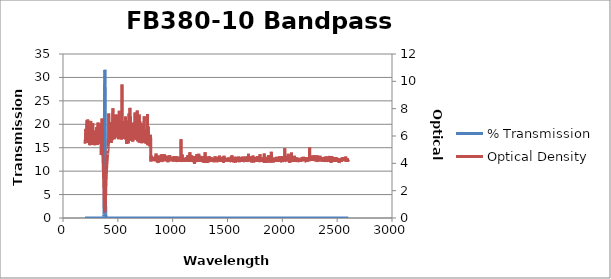
| Category | % Transmission |
|---|---|
| 2600.0 | 0.007 |
| 2599.0 | 0.007 |
| 2598.0 | 0.006 |
| 2597.0 | 0.008 |
| 2596.0 | 0.006 |
| 2595.0 | 0.006 |
| 2594.0 | 0.006 |
| 2593.0 | 0.004 |
| 2592.0 | 0.005 |
| 2591.0 | 0.007 |
| 2590.0 | 0.004 |
| 2589.0 | 0.005 |
| 2588.0 | 0.007 |
| 2587.0 | 0.004 |
| 2586.0 | 0.007 |
| 2585.0 | 0.005 |
| 2584.0 | 0.006 |
| 2583.0 | 0.005 |
| 2582.0 | 0.004 |
| 2581.0 | 0.005 |
| 2580.0 | 0.007 |
| 2579.0 | 0.005 |
| 2578.0 | 0.003 |
| 2577.0 | 0.006 |
| 2576.0 | 0.007 |
| 2575.0 | 0.006 |
| 2574.0 | 0.006 |
| 2573.0 | 0.005 |
| 2572.0 | 0.004 |
| 2571.0 | 0.006 |
| 2570.0 | 0.005 |
| 2569.0 | 0.007 |
| 2568.0 | 0.006 |
| 2567.0 | 0.006 |
| 2566.0 | 0.006 |
| 2565.0 | 0.004 |
| 2564.0 | 0.006 |
| 2563.0 | 0.006 |
| 2562.0 | 0.004 |
| 2561.0 | 0.005 |
| 2560.0 | 0.006 |
| 2559.0 | 0.005 |
| 2558.0 | 0.006 |
| 2557.0 | 0.004 |
| 2556.0 | 0.006 |
| 2555.0 | 0.005 |
| 2554.0 | 0.005 |
| 2553.0 | 0.006 |
| 2552.0 | 0.004 |
| 2551.0 | 0.005 |
| 2550.0 | 0.005 |
| 2549.0 | 0.006 |
| 2548.0 | 0.005 |
| 2547.0 | 0.006 |
| 2546.0 | 0.005 |
| 2545.0 | 0.004 |
| 2544.0 | 0.007 |
| 2543.0 | 0.004 |
| 2542.0 | 0.005 |
| 2541.0 | 0.005 |
| 2540.0 | 0.008 |
| 2539.0 | 0.006 |
| 2538.0 | 0.007 |
| 2537.0 | 0.005 |
| 2536.0 | 0.006 |
| 2535.0 | 0.007 |
| 2534.0 | 0.005 |
| 2533.0 | 0.006 |
| 2532.0 | 0.005 |
| 2531.0 | 0.006 |
| 2530.0 | 0.006 |
| 2529.0 | 0.005 |
| 2528.0 | 0.005 |
| 2527.0 | 0.005 |
| 2526.0 | 0.005 |
| 2525.0 | 0.006 |
| 2524.0 | 0.006 |
| 2523.0 | 0.005 |
| 2522.0 | 0.005 |
| 2521.0 | 0.006 |
| 2520.0 | 0.007 |
| 2519.0 | 0.007 |
| 2518.0 | 0.01 |
| 2517.0 | 0.005 |
| 2516.0 | 0.007 |
| 2515.0 | 0.007 |
| 2514.0 | 0.006 |
| 2513.0 | 0.006 |
| 2512.0 | 0.006 |
| 2511.0 | 0.005 |
| 2510.0 | 0.004 |
| 2509.0 | 0.006 |
| 2508.0 | 0.005 |
| 2507.0 | 0.006 |
| 2506.0 | 0.006 |
| 2505.0 | 0.005 |
| 2504.0 | 0.005 |
| 2503.0 | 0.006 |
| 2502.0 | 0.006 |
| 2501.0 | 0.004 |
| 2500.0 | 0.005 |
| 2499.0 | 0.006 |
| 2498.0 | 0.005 |
| 2497.0 | 0.005 |
| 2496.0 | 0.004 |
| 2495.0 | 0.007 |
| 2494.0 | 0.008 |
| 2493.0 | 0.005 |
| 2492.0 | 0.005 |
| 2491.0 | 0.004 |
| 2490.0 | 0.006 |
| 2489.0 | 0.008 |
| 2488.0 | 0.005 |
| 2487.0 | 0.004 |
| 2486.0 | 0.004 |
| 2485.0 | 0.005 |
| 2484.0 | 0.004 |
| 2483.0 | 0.004 |
| 2482.0 | 0.006 |
| 2481.0 | 0.006 |
| 2480.0 | 0.007 |
| 2479.0 | 0.004 |
| 2478.0 | 0.005 |
| 2477.0 | 0.006 |
| 2476.0 | 0.005 |
| 2475.0 | 0.005 |
| 2474.0 | 0.007 |
| 2473.0 | 0.005 |
| 2472.0 | 0.004 |
| 2471.0 | 0.006 |
| 2470.0 | 0.007 |
| 2469.0 | 0.005 |
| 2468.0 | 0.007 |
| 2467.0 | 0.007 |
| 2466.0 | 0.007 |
| 2465.0 | 0.006 |
| 2464.0 | 0.004 |
| 2463.0 | 0.007 |
| 2462.0 | 0.007 |
| 2461.0 | 0.004 |
| 2460.0 | 0.007 |
| 2459.0 | 0.007 |
| 2458.0 | 0.006 |
| 2457.0 | 0.007 |
| 2456.0 | 0.004 |
| 2455.0 | 0.006 |
| 2454.0 | 0.004 |
| 2453.0 | 0.003 |
| 2452.0 | 0.005 |
| 2451.0 | 0.007 |
| 2450.0 | 0.003 |
| 2449.0 | 0.006 |
| 2448.0 | 0.006 |
| 2447.0 | 0.007 |
| 2446.0 | 0.004 |
| 2445.0 | 0.009 |
| 2444.0 | 0.006 |
| 2443.0 | 0.008 |
| 2442.0 | 0.004 |
| 2441.0 | 0.006 |
| 2440.0 | 0.003 |
| 2439.0 | 0.004 |
| 2438.0 | 0.005 |
| 2437.0 | 0.004 |
| 2436.0 | 0.005 |
| 2435.0 | 0.005 |
| 2434.0 | 0.007 |
| 2433.0 | 0.005 |
| 2432.0 | 0.008 |
| 2431.0 | 0.006 |
| 2430.0 | 0.003 |
| 2429.0 | 0.004 |
| 2428.0 | 0.005 |
| 2427.0 | 0.007 |
| 2426.0 | 0.005 |
| 2425.0 | 0.006 |
| 2424.0 | 0.008 |
| 2423.0 | 0.006 |
| 2422.0 | 0.005 |
| 2421.0 | 0.005 |
| 2420.0 | 0.004 |
| 2419.0 | 0.005 |
| 2418.0 | 0.007 |
| 2417.0 | 0.007 |
| 2416.0 | 0.003 |
| 2415.0 | 0.007 |
| 2414.0 | 0.006 |
| 2413.0 | 0.004 |
| 2412.0 | 0.006 |
| 2411.0 | 0.005 |
| 2410.0 | 0.003 |
| 2409.0 | 0.006 |
| 2408.0 | 0.004 |
| 2407.0 | 0.006 |
| 2406.0 | 0.008 |
| 2405.0 | 0.005 |
| 2404.0 | 0.005 |
| 2403.0 | 0.004 |
| 2402.0 | 0.004 |
| 2401.0 | 0.005 |
| 2400.0 | 0.006 |
| 2399.0 | 0.006 |
| 2398.0 | 0.003 |
| 2397.0 | 0.004 |
| 2396.0 | 0.006 |
| 2395.0 | 0.005 |
| 2394.0 | 0.006 |
| 2393.0 | 0.006 |
| 2392.0 | 0.005 |
| 2391.0 | 0.005 |
| 2390.0 | 0.006 |
| 2389.0 | 0.006 |
| 2388.0 | 0.006 |
| 2387.0 | 0.005 |
| 2386.0 | 0.004 |
| 2385.0 | 0.003 |
| 2384.0 | 0.006 |
| 2383.0 | 0.004 |
| 2382.0 | 0.004 |
| 2381.0 | 0.006 |
| 2380.0 | 0.006 |
| 2379.0 | 0.004 |
| 2378.0 | 0.005 |
| 2377.0 | 0.006 |
| 2376.0 | 0.005 |
| 2375.0 | 0.005 |
| 2374.0 | 0.005 |
| 2373.0 | 0.005 |
| 2372.0 | 0.007 |
| 2371.0 | 0.005 |
| 2370.0 | 0.007 |
| 2369.0 | 0.007 |
| 2368.0 | 0.005 |
| 2367.0 | 0.004 |
| 2366.0 | 0.007 |
| 2365.0 | 0.005 |
| 2364.0 | 0.005 |
| 2363.0 | 0.005 |
| 2362.0 | 0.007 |
| 2361.0 | 0.005 |
| 2360.0 | 0.004 |
| 2359.0 | 0.006 |
| 2358.0 | 0.006 |
| 2357.0 | 0.007 |
| 2356.0 | 0.005 |
| 2355.0 | 0.006 |
| 2354.0 | 0.005 |
| 2353.0 | 0.006 |
| 2352.0 | 0.004 |
| 2351.0 | 0.004 |
| 2350.0 | 0.006 |
| 2349.0 | 0.004 |
| 2348.0 | 0.006 |
| 2347.0 | 0.006 |
| 2346.0 | 0.005 |
| 2345.0 | 0.007 |
| 2344.0 | 0.004 |
| 2343.0 | 0.003 |
| 2342.0 | 0.006 |
| 2341.0 | 0.005 |
| 2340.0 | 0.007 |
| 2339.0 | 0.005 |
| 2338.0 | 0.004 |
| 2337.0 | 0.007 |
| 2336.0 | 0.005 |
| 2335.0 | 0.005 |
| 2334.0 | 0.004 |
| 2333.0 | 0.004 |
| 2332.0 | 0.006 |
| 2331.0 | 0.004 |
| 2330.0 | 0.004 |
| 2329.0 | 0.007 |
| 2328.0 | 0.006 |
| 2327.0 | 0.003 |
| 2326.0 | 0.006 |
| 2325.0 | 0.003 |
| 2324.0 | 0.005 |
| 2323.0 | 0.003 |
| 2322.0 | 0.007 |
| 2321.0 | 0.004 |
| 2320.0 | 0.006 |
| 2319.0 | 0.006 |
| 2318.0 | 0.006 |
| 2317.0 | 0.008 |
| 2316.0 | 0.003 |
| 2315.0 | 0.006 |
| 2314.0 | 0.007 |
| 2313.0 | 0.007 |
| 2312.0 | 0.007 |
| 2311.0 | 0.003 |
| 2310.0 | 0.005 |
| 2309.0 | 0.005 |
| 2308.0 | 0.004 |
| 2307.0 | 0.005 |
| 2306.0 | 0.004 |
| 2305.0 | 0.005 |
| 2304.0 | 0.006 |
| 2303.0 | 0.006 |
| 2302.0 | 0.004 |
| 2301.0 | 0.007 |
| 2300.0 | 0.006 |
| 2299.0 | 0.005 |
| 2298.0 | 0.005 |
| 2297.0 | 0.005 |
| 2296.0 | 0.006 |
| 2295.0 | 0.004 |
| 2294.0 | 0.005 |
| 2293.0 | 0.005 |
| 2292.0 | 0.005 |
| 2291.0 | 0.003 |
| 2290.0 | 0.005 |
| 2289.0 | 0.003 |
| 2288.0 | 0.002 |
| 2287.0 | 0.004 |
| 2286.0 | 0.003 |
| 2285.0 | 0.005 |
| 2284.0 | 0.004 |
| 2283.0 | 0.005 |
| 2282.0 | 0.006 |
| 2281.0 | 0.004 |
| 2280.0 | 0.005 |
| 2279.0 | 0.005 |
| 2278.0 | 0.005 |
| 2277.0 | 0.005 |
| 2276.0 | 0.007 |
| 2275.0 | 0.003 |
| 2274.0 | 0.004 |
| 2273.0 | 0.005 |
| 2272.0 | 0.006 |
| 2271.0 | 0.007 |
| 2270.0 | 0.005 |
| 2269.0 | 0.004 |
| 2268.0 | 0.004 |
| 2267.0 | 0.006 |
| 2266.0 | 0.005 |
| 2265.0 | 0.005 |
| 2264.0 | 0.005 |
| 2263.0 | 0.005 |
| 2262.0 | 0.006 |
| 2261.0 | 0.003 |
| 2260.0 | 0.004 |
| 2259.0 | 0.006 |
| 2258.0 | 0.003 |
| 2257.0 | 0.004 |
| 2256.0 | 0.006 |
| 2255.0 | 0.006 |
| 2254.0 | 0.005 |
| 2253.0 | 0.006 |
| 2252.0 | 0.006 |
| 2251.0 | 0.003 |
| 2250.0 | 0.005 |
| 2249.0 | 0.001 |
| 2248.0 | 0.004 |
| 2247.0 | 0.006 |
| 2246.0 | 0.006 |
| 2245.0 | 0.005 |
| 2244.0 | 0.005 |
| 2243.0 | 0.007 |
| 2242.0 | 0.005 |
| 2241.0 | 0.005 |
| 2240.0 | 0.005 |
| 2239.0 | 0.005 |
| 2238.0 | 0.003 |
| 2237.0 | 0.006 |
| 2236.0 | 0.005 |
| 2235.0 | 0.006 |
| 2234.0 | 0.006 |
| 2233.0 | 0.004 |
| 2232.0 | 0.007 |
| 2231.0 | 0.004 |
| 2230.0 | 0.004 |
| 2229.0 | 0.008 |
| 2228.0 | 0.006 |
| 2227.0 | 0.004 |
| 2226.0 | 0.007 |
| 2225.0 | 0.005 |
| 2224.0 | 0.007 |
| 2223.0 | 0.004 |
| 2222.0 | 0.004 |
| 2221.0 | 0.006 |
| 2220.0 | 0.007 |
| 2219.0 | 0.005 |
| 2218.0 | 0.005 |
| 2217.0 | 0.006 |
| 2216.0 | 0.007 |
| 2215.0 | 0.004 |
| 2214.0 | 0.006 |
| 2213.0 | 0.007 |
| 2212.0 | 0.006 |
| 2211.0 | 0.006 |
| 2210.0 | 0.007 |
| 2209.0 | 0.007 |
| 2208.0 | 0.005 |
| 2207.0 | 0.007 |
| 2206.0 | 0.004 |
| 2205.0 | 0.006 |
| 2204.0 | 0.005 |
| 2203.0 | 0.007 |
| 2202.0 | 0.006 |
| 2201.0 | 0.005 |
| 2200.0 | 0.005 |
| 2199.0 | 0.006 |
| 2198.0 | 0.004 |
| 2197.0 | 0.004 |
| 2196.0 | 0.004 |
| 2195.0 | 0.006 |
| 2194.0 | 0.004 |
| 2193.0 | 0.003 |
| 2192.0 | 0.004 |
| 2191.0 | 0.006 |
| 2190.0 | 0.006 |
| 2189.0 | 0.006 |
| 2188.0 | 0.004 |
| 2187.0 | 0.005 |
| 2186.0 | 0.004 |
| 2185.0 | 0.004 |
| 2184.0 | 0.006 |
| 2183.0 | 0.004 |
| 2182.0 | 0.005 |
| 2181.0 | 0.004 |
| 2180.0 | 0.005 |
| 2179.0 | 0.006 |
| 2178.0 | 0.006 |
| 2177.0 | 0.007 |
| 2176.0 | 0.005 |
| 2175.0 | 0.004 |
| 2174.0 | 0.006 |
| 2173.0 | 0.006 |
| 2172.0 | 0.006 |
| 2171.0 | 0.006 |
| 2170.0 | 0.005 |
| 2169.0 | 0.004 |
| 2168.0 | 0.006 |
| 2167.0 | 0.007 |
| 2166.0 | 0.007 |
| 2165.0 | 0.006 |
| 2164.0 | 0.006 |
| 2163.0 | 0.006 |
| 2162.0 | 0.005 |
| 2161.0 | 0.005 |
| 2160.0 | 0.006 |
| 2159.0 | 0.006 |
| 2158.0 | 0.005 |
| 2157.0 | 0.007 |
| 2156.0 | 0.004 |
| 2155.0 | 0.006 |
| 2154.0 | 0.007 |
| 2153.0 | 0.006 |
| 2152.0 | 0.005 |
| 2151.0 | 0.006 |
| 2150.0 | 0.005 |
| 2149.0 | 0.005 |
| 2148.0 | 0.006 |
| 2147.0 | 0.007 |
| 2146.0 | 0.006 |
| 2145.0 | 0.007 |
| 2144.0 | 0.006 |
| 2143.0 | 0.008 |
| 2142.0 | 0.006 |
| 2141.0 | 0.004 |
| 2140.0 | 0.005 |
| 2139.0 | 0.007 |
| 2138.0 | 0.006 |
| 2137.0 | 0.007 |
| 2136.0 | 0.005 |
| 2135.0 | 0.004 |
| 2134.0 | 0.006 |
| 2133.0 | 0.004 |
| 2132.0 | 0.005 |
| 2131.0 | 0.005 |
| 2130.0 | 0.005 |
| 2129.0 | 0.008 |
| 2128.0 | 0.006 |
| 2127.0 | 0.005 |
| 2126.0 | 0.006 |
| 2125.0 | 0.006 |
| 2124.0 | 0.004 |
| 2123.0 | 0.008 |
| 2122.0 | 0.008 |
| 2121.0 | 0.005 |
| 2120.0 | 0.006 |
| 2119.0 | 0.005 |
| 2118.0 | 0.004 |
| 2117.0 | 0.007 |
| 2116.0 | 0.008 |
| 2115.0 | 0.004 |
| 2114.0 | 0.007 |
| 2113.0 | 0.004 |
| 2112.0 | 0.006 |
| 2111.0 | 0.006 |
| 2110.0 | 0.003 |
| 2109.0 | 0.005 |
| 2108.0 | 0.006 |
| 2107.0 | 0.006 |
| 2106.0 | 0.006 |
| 2105.0 | 0.004 |
| 2104.0 | 0.005 |
| 2103.0 | 0.008 |
| 2102.0 | 0.004 |
| 2101.0 | 0.005 |
| 2100.0 | 0.006 |
| 2099.0 | 0.007 |
| 2098.0 | 0.004 |
| 2097.0 | 0.008 |
| 2096.0 | 0.006 |
| 2095.0 | 0.003 |
| 2094.0 | 0.004 |
| 2093.0 | 0.008 |
| 2092.0 | 0.005 |
| 2091.0 | 0.006 |
| 2090.0 | 0.004 |
| 2089.0 | 0.005 |
| 2088.0 | 0.007 |
| 2087.0 | 0.006 |
| 2086.0 | 0.007 |
| 2085.0 | 0.006 |
| 2084.0 | 0.005 |
| 2083.0 | 0.002 |
| 2082.0 | 0.004 |
| 2081.0 | 0.006 |
| 2080.0 | 0.006 |
| 2079.0 | 0.005 |
| 2078.0 | 0.005 |
| 2077.0 | 0.005 |
| 2076.0 | 0.003 |
| 2075.0 | 0.005 |
| 2074.0 | 0.004 |
| 2073.0 | 0.005 |
| 2072.0 | 0.004 |
| 2071.0 | 0.006 |
| 2070.0 | 0.003 |
| 2069.0 | 0.008 |
| 2068.0 | 0.007 |
| 2067.0 | 0.006 |
| 2066.0 | 0.009 |
| 2065.0 | 0.006 |
| 2064.0 | 0.006 |
| 2063.0 | 0.006 |
| 2062.0 | 0.006 |
| 2061.0 | 0.006 |
| 2060.0 | 0.006 |
| 2059.0 | 0.005 |
| 2058.0 | 0.007 |
| 2057.0 | 0.006 |
| 2056.0 | 0.005 |
| 2055.0 | 0.006 |
| 2054.0 | 0.002 |
| 2053.0 | 0.005 |
| 2052.0 | 0.005 |
| 2051.0 | 0.007 |
| 2050.0 | 0.006 |
| 2049.0 | 0.005 |
| 2048.0 | 0.006 |
| 2047.0 | 0.003 |
| 2046.0 | 0.005 |
| 2045.0 | 0.006 |
| 2044.0 | 0.007 |
| 2043.0 | 0.006 |
| 2042.0 | 0.004 |
| 2041.0 | 0.005 |
| 2040.0 | 0.005 |
| 2039.0 | 0.005 |
| 2038.0 | 0.005 |
| 2037.0 | 0.007 |
| 2036.0 | 0.005 |
| 2035.0 | 0.007 |
| 2034.0 | 0.004 |
| 2033.0 | 0.006 |
| 2032.0 | 0.006 |
| 2031.0 | 0.006 |
| 2030.0 | 0.007 |
| 2029.0 | 0.006 |
| 2028.0 | 0.003 |
| 2027.0 | 0.005 |
| 2026.0 | 0.005 |
| 2025.0 | 0.006 |
| 2024.0 | 0.005 |
| 2023.0 | 0.006 |
| 2022.0 | 0.001 |
| 2021.0 | 0.005 |
| 2020.0 | 0.005 |
| 2019.0 | 0.006 |
| 2018.0 | 0.007 |
| 2017.0 | 0.006 |
| 2016.0 | 0.006 |
| 2015.0 | 0.006 |
| 2014.0 | 0.005 |
| 2013.0 | 0.004 |
| 2012.0 | 0.006 |
| 2011.0 | 0.006 |
| 2010.0 | 0.007 |
| 2009.0 | 0.006 |
| 2008.0 | 0.006 |
| 2007.0 | 0.006 |
| 2006.0 | 0.006 |
| 2005.0 | 0.006 |
| 2004.0 | 0.003 |
| 2003.0 | 0.005 |
| 2002.0 | 0.003 |
| 2001.0 | 0.005 |
| 2000.0 | 0.003 |
| 1999.0 | 0.008 |
| 1998.0 | 0.008 |
| 1997.0 | 0.007 |
| 1996.0 | 0.008 |
| 1995.0 | 0.008 |
| 1994.0 | 0.005 |
| 1993.0 | 0.008 |
| 1992.0 | 0.007 |
| 1991.0 | 0.007 |
| 1990.0 | 0.007 |
| 1989.0 | 0.006 |
| 1988.0 | 0.004 |
| 1987.0 | 0.004 |
| 1986.0 | 0.004 |
| 1985.0 | 0.004 |
| 1984.0 | 0.008 |
| 1983.0 | 0.007 |
| 1982.0 | 0.006 |
| 1981.0 | 0.005 |
| 1980.0 | 0.006 |
| 1979.0 | 0.005 |
| 1978.0 | 0.006 |
| 1977.0 | 0.003 |
| 1976.0 | 0.006 |
| 1975.0 | 0.007 |
| 1974.0 | 0.004 |
| 1973.0 | 0.006 |
| 1972.0 | 0.006 |
| 1971.0 | 0.007 |
| 1970.0 | 0.005 |
| 1969.0 | 0.007 |
| 1968.0 | 0.005 |
| 1967.0 | 0.004 |
| 1966.0 | 0.004 |
| 1965.0 | 0.006 |
| 1964.0 | 0.005 |
| 1963.0 | 0.007 |
| 1962.0 | 0.005 |
| 1961.0 | 0.006 |
| 1960.0 | 0.005 |
| 1959.0 | 0.005 |
| 1958.0 | 0.008 |
| 1957.0 | 0.004 |
| 1956.0 | 0.005 |
| 1955.0 | 0.004 |
| 1954.0 | 0.008 |
| 1953.0 | 0.005 |
| 1952.0 | 0.006 |
| 1951.0 | 0.004 |
| 1950.0 | 0.003 |
| 1949.0 | 0.006 |
| 1948.0 | 0.004 |
| 1947.0 | 0.005 |
| 1946.0 | 0.006 |
| 1945.0 | 0.006 |
| 1944.0 | 0.005 |
| 1943.0 | 0.007 |
| 1942.0 | 0.004 |
| 1941.0 | 0.006 |
| 1940.0 | 0.007 |
| 1939.0 | 0.004 |
| 1938.0 | 0.005 |
| 1937.0 | 0.005 |
| 1936.0 | 0.005 |
| 1935.0 | 0.004 |
| 1934.0 | 0.005 |
| 1933.0 | 0.005 |
| 1932.0 | 0.005 |
| 1931.0 | 0.007 |
| 1930.0 | 0.008 |
| 1929.0 | 0.006 |
| 1928.0 | 0.004 |
| 1927.0 | 0.006 |
| 1926.0 | 0.007 |
| 1925.0 | 0.005 |
| 1924.0 | 0.005 |
| 1923.0 | 0.006 |
| 1922.0 | 0.005 |
| 1921.0 | 0.005 |
| 1920.0 | 0.009 |
| 1919.0 | 0.005 |
| 1918.0 | 0.005 |
| 1917.0 | 0.007 |
| 1916.0 | 0.006 |
| 1915.0 | 0.006 |
| 1914.0 | 0.006 |
| 1913.0 | 0.006 |
| 1912.0 | 0.006 |
| 1911.0 | 0.005 |
| 1910.0 | 0.007 |
| 1909.0 | 0.006 |
| 1908.0 | 0.008 |
| 1907.0 | 0.007 |
| 1906.0 | 0.006 |
| 1905.0 | 0.005 |
| 1904.0 | 0.008 |
| 1903.0 | 0.008 |
| 1902.0 | 0.005 |
| 1901.0 | 0.006 |
| 1900.0 | 0.001 |
| 1899.0 | 0.005 |
| 1898.0 | 0.004 |
| 1897.0 | 0.008 |
| 1896.0 | 0.006 |
| 1895.0 | 0.005 |
| 1894.0 | 0.006 |
| 1893.0 | 0.008 |
| 1892.0 | 0.009 |
| 1891.0 | 0.004 |
| 1890.0 | 0.004 |
| 1889.0 | 0.006 |
| 1888.0 | 0.005 |
| 1887.0 | 0.007 |
| 1886.0 | 0.005 |
| 1885.0 | 0.004 |
| 1884.0 | 0.005 |
| 1883.0 | 0.005 |
| 1882.0 | 0.006 |
| 1881.0 | 0.006 |
| 1880.0 | 0.006 |
| 1879.0 | 0.007 |
| 1878.0 | 0.006 |
| 1877.0 | 0.003 |
| 1876.0 | 0.005 |
| 1875.0 | 0.006 |
| 1874.0 | 0.003 |
| 1873.0 | 0.006 |
| 1872.0 | 0.004 |
| 1871.0 | 0.004 |
| 1870.0 | 0.008 |
| 1869.0 | 0.006 |
| 1868.0 | 0.006 |
| 1867.0 | 0.007 |
| 1866.0 | 0.007 |
| 1865.0 | 0.003 |
| 1864.0 | 0.005 |
| 1863.0 | 0.006 |
| 1862.0 | 0.006 |
| 1861.0 | 0.007 |
| 1860.0 | 0.004 |
| 1859.0 | 0.006 |
| 1858.0 | 0.004 |
| 1857.0 | 0.006 |
| 1856.0 | 0.005 |
| 1855.0 | 0.007 |
| 1854.0 | 0.005 |
| 1853.0 | 0.006 |
| 1852.0 | 0.006 |
| 1851.0 | 0.004 |
| 1850.0 | 0.005 |
| 1849.0 | 0.007 |
| 1848.0 | 0.009 |
| 1847.0 | 0.005 |
| 1846.0 | 0.007 |
| 1845.0 | 0.007 |
| 1844.0 | 0.005 |
| 1843.0 | 0.007 |
| 1842.0 | 0.004 |
| 1841.0 | 0.006 |
| 1840.0 | 0.006 |
| 1839.0 | 0.006 |
| 1838.0 | 0.005 |
| 1837.0 | 0.006 |
| 1836.0 | 0.009 |
| 1835.0 | 0.002 |
| 1834.0 | 0.005 |
| 1833.0 | 0.005 |
| 1832.0 | 0.006 |
| 1831.0 | 0.004 |
| 1830.0 | 0.005 |
| 1829.0 | 0.006 |
| 1828.0 | 0.006 |
| 1827.0 | 0.004 |
| 1826.0 | 0.007 |
| 1825.0 | 0.006 |
| 1824.0 | 0.005 |
| 1823.0 | 0.006 |
| 1822.0 | 0.008 |
| 1821.0 | 0.006 |
| 1820.0 | 0.005 |
| 1819.0 | 0.005 |
| 1818.0 | 0.005 |
| 1817.0 | 0.007 |
| 1816.0 | 0.007 |
| 1815.0 | 0.006 |
| 1814.0 | 0.005 |
| 1813.0 | 0.004 |
| 1812.0 | 0.006 |
| 1811.0 | 0.006 |
| 1810.0 | 0.006 |
| 1809.0 | 0.004 |
| 1808.0 | 0.005 |
| 1807.0 | 0.004 |
| 1806.0 | 0.008 |
| 1805.0 | 0.005 |
| 1804.0 | 0.005 |
| 1803.0 | 0.005 |
| 1802.0 | 0.006 |
| 1801.0 | 0.005 |
| 1800.0 | 0.006 |
| 1799.0 | 0.005 |
| 1798.0 | 0.007 |
| 1797.0 | 0.005 |
| 1796.0 | 0.002 |
| 1795.0 | 0.005 |
| 1794.0 | 0.007 |
| 1793.0 | 0.007 |
| 1792.0 | 0.008 |
| 1791.0 | 0.006 |
| 1790.0 | 0.006 |
| 1789.0 | 0.007 |
| 1788.0 | 0.005 |
| 1787.0 | 0.005 |
| 1786.0 | 0.007 |
| 1785.0 | 0.006 |
| 1784.0 | 0.006 |
| 1783.0 | 0.004 |
| 1782.0 | 0.006 |
| 1781.0 | 0.006 |
| 1780.0 | 0.005 |
| 1779.0 | 0.004 |
| 1778.0 | 0.006 |
| 1777.0 | 0.005 |
| 1776.0 | 0.004 |
| 1775.0 | 0.004 |
| 1774.0 | 0.004 |
| 1773.0 | 0.003 |
| 1772.0 | 0.007 |
| 1771.0 | 0.003 |
| 1770.0 | 0.003 |
| 1769.0 | 0.007 |
| 1768.0 | 0.005 |
| 1767.0 | 0.006 |
| 1766.0 | 0.006 |
| 1765.0 | 0.006 |
| 1764.0 | 0.003 |
| 1763.0 | 0.007 |
| 1762.0 | 0.007 |
| 1761.0 | 0.006 |
| 1760.0 | 0.004 |
| 1759.0 | 0.008 |
| 1758.0 | 0.005 |
| 1757.0 | 0.005 |
| 1756.0 | 0.004 |
| 1755.0 | 0.003 |
| 1754.0 | 0.006 |
| 1753.0 | 0.004 |
| 1752.0 | 0.007 |
| 1751.0 | 0.004 |
| 1750.0 | 0.006 |
| 1749.0 | 0.005 |
| 1748.0 | 0.006 |
| 1747.0 | 0.007 |
| 1746.0 | 0.005 |
| 1745.0 | 0.005 |
| 1744.0 | 0.006 |
| 1743.0 | 0.005 |
| 1742.0 | 0.004 |
| 1741.0 | 0.007 |
| 1740.0 | 0.005 |
| 1739.0 | 0.009 |
| 1738.0 | 0.005 |
| 1737.0 | 0.007 |
| 1736.0 | 0.004 |
| 1735.0 | 0.005 |
| 1734.0 | 0.004 |
| 1733.0 | 0.003 |
| 1732.0 | 0.005 |
| 1731.0 | 0.006 |
| 1730.0 | 0.004 |
| 1729.0 | 0.007 |
| 1728.0 | 0.006 |
| 1727.0 | 0.006 |
| 1726.0 | 0.008 |
| 1725.0 | 0.005 |
| 1724.0 | 0.008 |
| 1723.0 | 0.007 |
| 1722.0 | 0.005 |
| 1721.0 | 0.009 |
| 1720.0 | 0.006 |
| 1719.0 | 0.004 |
| 1718.0 | 0.007 |
| 1717.0 | 0.006 |
| 1716.0 | 0.004 |
| 1715.0 | 0.003 |
| 1714.0 | 0.003 |
| 1713.0 | 0.007 |
| 1712.0 | 0.005 |
| 1711.0 | 0.006 |
| 1710.0 | 0.007 |
| 1709.0 | 0.004 |
| 1708.0 | 0.005 |
| 1707.0 | 0.007 |
| 1706.0 | 0.005 |
| 1705.0 | 0.006 |
| 1704.0 | 0.004 |
| 1703.0 | 0.006 |
| 1702.0 | 0.006 |
| 1701.0 | 0.004 |
| 1700.0 | 0.006 |
| 1699.0 | 0.007 |
| 1698.0 | 0.005 |
| 1697.0 | 0.005 |
| 1696.0 | 0.007 |
| 1695.0 | 0.003 |
| 1694.0 | 0.005 |
| 1693.0 | 0.005 |
| 1692.0 | 0.002 |
| 1691.0 | 0.005 |
| 1690.0 | 0.006 |
| 1689.0 | 0.005 |
| 1688.0 | 0.008 |
| 1687.0 | 0.004 |
| 1686.0 | 0.003 |
| 1685.0 | 0.006 |
| 1684.0 | 0.003 |
| 1683.0 | 0.005 |
| 1682.0 | 0.004 |
| 1681.0 | 0.004 |
| 1680.0 | 0.008 |
| 1679.0 | 0.005 |
| 1678.0 | 0.006 |
| 1677.0 | 0.006 |
| 1676.0 | 0.005 |
| 1675.0 | 0.006 |
| 1674.0 | 0.005 |
| 1673.0 | 0.006 |
| 1672.0 | 0.008 |
| 1671.0 | 0.006 |
| 1670.0 | 0.007 |
| 1669.0 | 0.006 |
| 1668.0 | 0.005 |
| 1667.0 | 0.005 |
| 1666.0 | 0.004 |
| 1665.0 | 0.006 |
| 1664.0 | 0.006 |
| 1663.0 | 0.004 |
| 1662.0 | 0.006 |
| 1661.0 | 0.006 |
| 1660.0 | 0.003 |
| 1659.0 | 0.004 |
| 1658.0 | 0.007 |
| 1657.0 | 0.007 |
| 1656.0 | 0.004 |
| 1655.0 | 0.006 |
| 1654.0 | 0.005 |
| 1653.0 | 0.005 |
| 1652.0 | 0.004 |
| 1651.0 | 0.006 |
| 1650.0 | 0.007 |
| 1649.0 | 0.007 |
| 1648.0 | 0.007 |
| 1647.0 | 0.008 |
| 1646.0 | 0.006 |
| 1645.0 | 0.004 |
| 1644.0 | 0.005 |
| 1643.0 | 0.006 |
| 1642.0 | 0.003 |
| 1641.0 | 0.004 |
| 1640.0 | 0.006 |
| 1639.0 | 0.003 |
| 1638.0 | 0.006 |
| 1637.0 | 0.004 |
| 1636.0 | 0.005 |
| 1635.0 | 0.004 |
| 1634.0 | 0.008 |
| 1633.0 | 0.004 |
| 1632.0 | 0.006 |
| 1631.0 | 0.005 |
| 1630.0 | 0.007 |
| 1629.0 | 0.007 |
| 1628.0 | 0.005 |
| 1627.0 | 0.005 |
| 1626.0 | 0.006 |
| 1625.0 | 0.005 |
| 1624.0 | 0.006 |
| 1623.0 | 0.006 |
| 1622.0 | 0.006 |
| 1621.0 | 0.006 |
| 1620.0 | 0.004 |
| 1619.0 | 0.006 |
| 1618.0 | 0.005 |
| 1617.0 | 0.008 |
| 1616.0 | 0.005 |
| 1615.0 | 0.005 |
| 1614.0 | 0.004 |
| 1613.0 | 0.005 |
| 1612.0 | 0.005 |
| 1611.0 | 0.006 |
| 1610.0 | 0.005 |
| 1609.0 | 0.005 |
| 1608.0 | 0.008 |
| 1607.0 | 0.006 |
| 1606.0 | 0.006 |
| 1605.0 | 0.007 |
| 1604.0 | 0.005 |
| 1603.0 | 0.005 |
| 1602.0 | 0.003 |
| 1601.0 | 0.005 |
| 1600.0 | 0.004 |
| 1599.0 | 0.005 |
| 1598.0 | 0.005 |
| 1597.0 | 0.006 |
| 1596.0 | 0.006 |
| 1595.0 | 0.006 |
| 1594.0 | 0.006 |
| 1593.0 | 0.008 |
| 1592.0 | 0.007 |
| 1591.0 | 0.007 |
| 1590.0 | 0.007 |
| 1589.0 | 0.006 |
| 1588.0 | 0.004 |
| 1587.0 | 0.006 |
| 1586.0 | 0.007 |
| 1585.0 | 0.005 |
| 1584.0 | 0.005 |
| 1583.0 | 0.005 |
| 1582.0 | 0.005 |
| 1581.0 | 0.003 |
| 1580.0 | 0.004 |
| 1579.0 | 0.006 |
| 1578.0 | 0.004 |
| 1577.0 | 0.007 |
| 1576.0 | 0.005 |
| 1575.0 | 0.005 |
| 1574.0 | 0.008 |
| 1573.0 | 0.009 |
| 1572.0 | 0.007 |
| 1571.0 | 0.006 |
| 1570.0 | 0.005 |
| 1569.0 | 0.006 |
| 1568.0 | 0.004 |
| 1567.0 | 0.006 |
| 1566.0 | 0.004 |
| 1565.0 | 0.005 |
| 1564.0 | 0.003 |
| 1563.0 | 0.008 |
| 1562.0 | 0.006 |
| 1561.0 | 0.005 |
| 1560.0 | 0.006 |
| 1559.0 | 0.007 |
| 1558.0 | 0.005 |
| 1557.0 | 0.009 |
| 1556.0 | 0.004 |
| 1555.0 | 0.005 |
| 1554.0 | 0.004 |
| 1553.0 | 0.007 |
| 1552.0 | 0.006 |
| 1551.0 | 0.005 |
| 1550.0 | 0.006 |
| 1549.0 | 0.006 |
| 1548.0 | 0.006 |
| 1547.0 | 0.005 |
| 1546.0 | 0.005 |
| 1545.0 | 0.004 |
| 1544.0 | 0.005 |
| 1543.0 | 0.006 |
| 1542.0 | 0.005 |
| 1541.0 | 0.008 |
| 1540.0 | 0.003 |
| 1539.0 | 0.006 |
| 1538.0 | 0.006 |
| 1537.0 | 0.005 |
| 1536.0 | 0.006 |
| 1535.0 | 0.006 |
| 1534.0 | 0.007 |
| 1533.0 | 0.003 |
| 1532.0 | 0.006 |
| 1531.0 | 0.006 |
| 1530.0 | 0.004 |
| 1529.0 | 0.006 |
| 1528.0 | 0.006 |
| 1527.0 | 0.007 |
| 1526.0 | 0.006 |
| 1525.0 | 0.006 |
| 1524.0 | 0.006 |
| 1523.0 | 0.005 |
| 1522.0 | 0.005 |
| 1521.0 | 0.007 |
| 1520.0 | 0.005 |
| 1519.0 | 0.004 |
| 1518.0 | 0.005 |
| 1517.0 | 0.005 |
| 1516.0 | 0.006 |
| 1515.0 | 0.006 |
| 1514.0 | 0.004 |
| 1513.0 | 0.004 |
| 1512.0 | 0.005 |
| 1511.0 | 0.005 |
| 1510.0 | 0.005 |
| 1509.0 | 0.006 |
| 1508.0 | 0.005 |
| 1507.0 | 0.004 |
| 1506.0 | 0.005 |
| 1505.0 | 0.008 |
| 1504.0 | 0.006 |
| 1503.0 | 0.005 |
| 1502.0 | 0.004 |
| 1501.0 | 0.006 |
| 1500.0 | 0.005 |
| 1499.0 | 0.007 |
| 1498.0 | 0.004 |
| 1497.0 | 0.007 |
| 1496.0 | 0.006 |
| 1495.0 | 0.006 |
| 1494.0 | 0.005 |
| 1493.0 | 0.006 |
| 1492.0 | 0.006 |
| 1491.0 | 0.005 |
| 1490.0 | 0.004 |
| 1489.0 | 0.006 |
| 1488.0 | 0.007 |
| 1487.0 | 0.004 |
| 1486.0 | 0.007 |
| 1485.0 | 0.005 |
| 1484.0 | 0.005 |
| 1483.0 | 0.006 |
| 1482.0 | 0.006 |
| 1481.0 | 0.007 |
| 1480.0 | 0.005 |
| 1479.0 | 0.006 |
| 1478.0 | 0.007 |
| 1477.0 | 0.006 |
| 1476.0 | 0.006 |
| 1475.0 | 0.006 |
| 1474.0 | 0.008 |
| 1473.0 | 0.004 |
| 1472.0 | 0.006 |
| 1471.0 | 0.006 |
| 1470.0 | 0.007 |
| 1469.0 | 0.005 |
| 1468.0 | 0.003 |
| 1467.0 | 0.005 |
| 1466.0 | 0.005 |
| 1465.0 | 0.003 |
| 1464.0 | 0.009 |
| 1463.0 | 0.006 |
| 1462.0 | 0.005 |
| 1461.0 | 0.006 |
| 1460.0 | 0.006 |
| 1459.0 | 0.008 |
| 1458.0 | 0.007 |
| 1457.0 | 0.006 |
| 1456.0 | 0.004 |
| 1455.0 | 0.005 |
| 1454.0 | 0.007 |
| 1453.0 | 0.007 |
| 1452.0 | 0.005 |
| 1451.0 | 0.007 |
| 1450.0 | 0.004 |
| 1449.0 | 0.004 |
| 1448.0 | 0.003 |
| 1447.0 | 0.004 |
| 1446.0 | 0.004 |
| 1445.0 | 0.007 |
| 1444.0 | 0.005 |
| 1443.0 | 0.006 |
| 1442.0 | 0.007 |
| 1441.0 | 0.004 |
| 1440.0 | 0.005 |
| 1439.0 | 0.008 |
| 1438.0 | 0.005 |
| 1437.0 | 0.006 |
| 1436.0 | 0.005 |
| 1435.0 | 0.005 |
| 1434.0 | 0.007 |
| 1433.0 | 0.007 |
| 1432.0 | 0.005 |
| 1431.0 | 0.004 |
| 1430.0 | 0.006 |
| 1429.0 | 0.004 |
| 1428.0 | 0.006 |
| 1427.0 | 0.003 |
| 1426.0 | 0.005 |
| 1425.0 | 0.006 |
| 1424.0 | 0.006 |
| 1423.0 | 0.004 |
| 1422.0 | 0.008 |
| 1421.0 | 0.004 |
| 1420.0 | 0.007 |
| 1419.0 | 0.005 |
| 1418.0 | 0.004 |
| 1417.0 | 0.004 |
| 1416.0 | 0.005 |
| 1415.0 | 0.004 |
| 1414.0 | 0.005 |
| 1413.0 | 0.006 |
| 1412.0 | 0.004 |
| 1411.0 | 0.005 |
| 1410.0 | 0.007 |
| 1409.0 | 0.006 |
| 1408.0 | 0.006 |
| 1407.0 | 0.006 |
| 1406.0 | 0.005 |
| 1405.0 | 0.008 |
| 1404.0 | 0.006 |
| 1403.0 | 0.006 |
| 1402.0 | 0.007 |
| 1401.0 | 0.005 |
| 1400.0 | 0.003 |
| 1399.0 | 0.006 |
| 1398.0 | 0.005 |
| 1397.0 | 0.005 |
| 1396.0 | 0.006 |
| 1395.0 | 0.007 |
| 1394.0 | 0.005 |
| 1393.0 | 0.007 |
| 1392.0 | 0.007 |
| 1391.0 | 0.006 |
| 1390.0 | 0.007 |
| 1389.0 | 0.004 |
| 1388.0 | 0.006 |
| 1387.0 | 0.003 |
| 1386.0 | 0.004 |
| 1385.0 | 0.004 |
| 1384.0 | 0.004 |
| 1383.0 | 0.004 |
| 1382.0 | 0.006 |
| 1381.0 | 0.006 |
| 1380.0 | 0.004 |
| 1379.0 | 0.006 |
| 1378.0 | 0.004 |
| 1377.0 | 0.008 |
| 1376.0 | 0.006 |
| 1375.0 | 0.005 |
| 1374.0 | 0.006 |
| 1373.0 | 0.005 |
| 1372.0 | 0.004 |
| 1371.0 | 0.007 |
| 1370.0 | 0.005 |
| 1369.0 | 0.006 |
| 1368.0 | 0.005 |
| 1367.0 | 0.005 |
| 1366.0 | 0.007 |
| 1365.0 | 0.005 |
| 1364.0 | 0.005 |
| 1363.0 | 0.005 |
| 1362.0 | 0.005 |
| 1361.0 | 0.006 |
| 1360.0 | 0.007 |
| 1359.0 | 0.005 |
| 1358.0 | 0.005 |
| 1357.0 | 0.007 |
| 1356.0 | 0.005 |
| 1355.0 | 0.006 |
| 1354.0 | 0.006 |
| 1353.0 | 0.004 |
| 1352.0 | 0.004 |
| 1351.0 | 0.006 |
| 1350.0 | 0.004 |
| 1349.0 | 0.007 |
| 1348.0 | 0.004 |
| 1347.0 | 0.006 |
| 1346.0 | 0.008 |
| 1345.0 | 0.004 |
| 1344.0 | 0.004 |
| 1343.0 | 0.007 |
| 1342.0 | 0.004 |
| 1341.0 | 0.004 |
| 1340.0 | 0.006 |
| 1339.0 | 0.004 |
| 1338.0 | 0.004 |
| 1337.0 | 0.005 |
| 1336.0 | 0.006 |
| 1335.0 | 0.003 |
| 1334.0 | 0.003 |
| 1333.0 | 0.005 |
| 1332.0 | 0.008 |
| 1331.0 | 0.004 |
| 1330.0 | 0.006 |
| 1329.0 | 0.005 |
| 1328.0 | 0.008 |
| 1327.0 | 0.004 |
| 1326.0 | 0.004 |
| 1325.0 | 0.006 |
| 1324.0 | 0.003 |
| 1323.0 | 0.004 |
| 1322.0 | 0.005 |
| 1321.0 | 0.005 |
| 1320.0 | 0.005 |
| 1319.0 | 0.005 |
| 1318.0 | 0.008 |
| 1317.0 | 0.006 |
| 1316.0 | 0.005 |
| 1315.0 | 0.005 |
| 1314.0 | 0.01 |
| 1313.0 | 0.004 |
| 1312.0 | 0.007 |
| 1311.0 | 0.004 |
| 1310.0 | 0.005 |
| 1309.0 | 0.007 |
| 1308.0 | 0.004 |
| 1307.0 | 0.005 |
| 1306.0 | 0.005 |
| 1305.0 | 0.006 |
| 1304.0 | 0.004 |
| 1303.0 | 0.008 |
| 1302.0 | 0.005 |
| 1301.0 | 0.003 |
| 1300.0 | 0.005 |
| 1299.0 | 0.008 |
| 1298.0 | 0.008 |
| 1297.0 | 0.007 |
| 1296.0 | 0.002 |
| 1295.0 | 0.005 |
| 1294.0 | 0.005 |
| 1293.0 | 0.009 |
| 1292.0 | 0.004 |
| 1291.0 | 0.007 |
| 1290.0 | 0.006 |
| 1289.0 | 0.008 |
| 1288.0 | 0.008 |
| 1287.0 | 0.008 |
| 1286.0 | 0.003 |
| 1285.0 | 0.005 |
| 1284.0 | 0.005 |
| 1283.0 | 0.004 |
| 1282.0 | 0.006 |
| 1281.0 | 0.005 |
| 1280.0 | 0.009 |
| 1279.0 | 0.005 |
| 1278.0 | 0.004 |
| 1277.0 | 0.005 |
| 1276.0 | 0.005 |
| 1275.0 | 0.007 |
| 1274.0 | 0.004 |
| 1273.0 | 0.004 |
| 1272.0 | 0.008 |
| 1271.0 | 0.003 |
| 1270.0 | 0.004 |
| 1269.0 | 0.005 |
| 1268.0 | 0.005 |
| 1267.0 | 0.005 |
| 1266.0 | 0.005 |
| 1265.0 | 0.005 |
| 1264.0 | 0.004 |
| 1263.0 | 0.005 |
| 1262.0 | 0.005 |
| 1261.0 | 0.006 |
| 1260.0 | 0.007 |
| 1259.0 | 0.005 |
| 1258.0 | 0.005 |
| 1257.0 | 0.005 |
| 1256.0 | 0.008 |
| 1255.0 | 0.004 |
| 1254.0 | 0.005 |
| 1253.0 | 0.006 |
| 1252.0 | 0.004 |
| 1251.0 | 0.004 |
| 1250.0 | 0.003 |
| 1249.0 | 0.006 |
| 1248.0 | 0.007 |
| 1247.0 | 0.005 |
| 1246.0 | 0.006 |
| 1245.0 | 0.003 |
| 1244.0 | 0.004 |
| 1243.0 | 0.007 |
| 1242.0 | 0.005 |
| 1241.0 | 0.007 |
| 1240.0 | 0.005 |
| 1239.0 | 0.005 |
| 1238.0 | 0.002 |
| 1237.0 | 0.005 |
| 1236.0 | 0.005 |
| 1235.0 | 0.006 |
| 1234.0 | 0.005 |
| 1233.0 | 0.006 |
| 1232.0 | 0.006 |
| 1231.0 | 0.006 |
| 1230.0 | 0.006 |
| 1229.0 | 0.007 |
| 1228.0 | 0.004 |
| 1227.0 | 0.008 |
| 1226.0 | 0.008 |
| 1225.0 | 0.003 |
| 1224.0 | 0.007 |
| 1223.0 | 0.007 |
| 1222.0 | 0.004 |
| 1221.0 | 0.002 |
| 1220.0 | 0.007 |
| 1219.0 | 0.005 |
| 1218.0 | 0.006 |
| 1217.0 | 0.004 |
| 1216.0 | 0.006 |
| 1215.0 | 0.005 |
| 1214.0 | 0.006 |
| 1213.0 | 0.004 |
| 1212.0 | 0.006 |
| 1211.0 | 0.004 |
| 1210.0 | 0.008 |
| 1209.0 | 0.007 |
| 1208.0 | 0.005 |
| 1207.0 | 0.003 |
| 1206.0 | 0.004 |
| 1205.0 | 0.006 |
| 1204.0 | 0.006 |
| 1203.0 | 0.003 |
| 1202.0 | 0.006 |
| 1201.0 | 0.005 |
| 1200.0 | 0.005 |
| 1199.0 | 0.011 |
| 1198.0 | 0.005 |
| 1197.0 | 0.009 |
| 1196.0 | 0.008 |
| 1195.0 | 0.006 |
| 1194.0 | 0.006 |
| 1193.0 | 0.006 |
| 1192.0 | 0.005 |
| 1191.0 | 0.005 |
| 1190.0 | 0.005 |
| 1189.0 | 0.007 |
| 1188.0 | 0.005 |
| 1187.0 | 0.008 |
| 1186.0 | 0.003 |
| 1185.0 | 0.006 |
| 1184.0 | 0.003 |
| 1183.0 | 0.006 |
| 1182.0 | 0.006 |
| 1181.0 | 0.005 |
| 1180.0 | 0.004 |
| 1179.0 | 0.004 |
| 1178.0 | 0.004 |
| 1177.0 | 0.008 |
| 1176.0 | 0.005 |
| 1175.0 | 0.003 |
| 1174.0 | 0.007 |
| 1173.0 | 0.006 |
| 1172.0 | 0.007 |
| 1171.0 | 0.003 |
| 1170.0 | 0.004 |
| 1169.0 | 0.003 |
| 1168.0 | 0.003 |
| 1167.0 | 0.008 |
| 1166.0 | 0.006 |
| 1165.0 | 0.004 |
| 1164.0 | 0.007 |
| 1163.0 | 0.006 |
| 1162.0 | 0.006 |
| 1161.0 | 0.006 |
| 1160.0 | 0.005 |
| 1159.0 | 0.005 |
| 1158.0 | 0.005 |
| 1157.0 | 0.002 |
| 1156.0 | 0.004 |
| 1155.0 | 0.006 |
| 1154.0 | 0.004 |
| 1153.0 | 0.005 |
| 1152.0 | 0.004 |
| 1151.0 | 0.008 |
| 1150.0 | 0.004 |
| 1149.0 | 0.007 |
| 1148.0 | 0.005 |
| 1147.0 | 0.006 |
| 1146.0 | 0.007 |
| 1145.0 | 0.005 |
| 1144.0 | 0.004 |
| 1143.0 | 0.006 |
| 1142.0 | 0.005 |
| 1141.0 | 0.003 |
| 1140.0 | 0.008 |
| 1139.0 | 0.006 |
| 1138.0 | 0.004 |
| 1137.0 | 0.003 |
| 1136.0 | 0.007 |
| 1135.0 | 0.007 |
| 1134.0 | 0.004 |
| 1133.0 | 0.006 |
| 1132.0 | 0.004 |
| 1131.0 | 0.006 |
| 1130.0 | 0.007 |
| 1129.0 | 0.005 |
| 1128.0 | 0.004 |
| 1127.0 | 0.004 |
| 1126.0 | 0.006 |
| 1125.0 | 0.005 |
| 1124.0 | 0.004 |
| 1123.0 | 0.006 |
| 1122.0 | 0.006 |
| 1121.0 | 0.004 |
| 1120.0 | 0.006 |
| 1119.0 | 0.005 |
| 1118.0 | 0.006 |
| 1117.0 | 0.006 |
| 1116.0 | 0.005 |
| 1115.0 | 0.005 |
| 1114.0 | 0.005 |
| 1113.0 | 0.005 |
| 1112.0 | 0.006 |
| 1111.0 | 0.007 |
| 1110.0 | 0.006 |
| 1109.0 | 0.008 |
| 1108.0 | 0.005 |
| 1107.0 | 0.005 |
| 1106.0 | 0.006 |
| 1105.0 | 0.007 |
| 1104.0 | 0.004 |
| 1103.0 | 0.005 |
| 1102.0 | 0.006 |
| 1101.0 | 0.006 |
| 1100.0 | 0.004 |
| 1099.0 | 0.005 |
| 1098.0 | 0.006 |
| 1097.0 | 0.007 |
| 1096.0 | 0.006 |
| 1095.0 | 0.006 |
| 1094.0 | 0.005 |
| 1093.0 | 0.005 |
| 1092.0 | 0.004 |
| 1091.0 | 0.004 |
| 1090.0 | 0.007 |
| 1089.0 | 0.008 |
| 1088.0 | 0.002 |
| 1087.0 | 0.006 |
| 1086.0 | 0.003 |
| 1085.0 | 0.005 |
| 1084.0 | 0.006 |
| 1083.0 | 0.006 |
| 1082.0 | 0.005 |
| 1081.0 | 0.005 |
| 1080.0 | 0.007 |
| 1079.0 | 0.006 |
| 1078.0 | 0.005 |
| 1077.0 | 0.006 |
| 1076.0 | 0 |
| 1075.0 | 0.005 |
| 1074.0 | 0.006 |
| 1073.0 | 0.008 |
| 1072.0 | 0.007 |
| 1071.0 | 0.008 |
| 1070.0 | 0.006 |
| 1069.0 | 0.004 |
| 1068.0 | 0.005 |
| 1067.0 | 0.007 |
| 1066.0 | 0.004 |
| 1065.0 | 0.006 |
| 1064.0 | 0.006 |
| 1063.0 | 0.004 |
| 1062.0 | 0.003 |
| 1061.0 | 0.006 |
| 1060.0 | 0.007 |
| 1059.0 | 0.004 |
| 1058.0 | 0.006 |
| 1057.0 | 0.006 |
| 1056.0 | 0.005 |
| 1055.0 | 0.004 |
| 1054.0 | 0.006 |
| 1053.0 | 0.006 |
| 1052.0 | 0.007 |
| 1051.0 | 0.006 |
| 1050.0 | 0.006 |
| 1049.0 | 0.004 |
| 1048.0 | 0.005 |
| 1047.0 | 0.004 |
| 1046.0 | 0.006 |
| 1045.0 | 0.005 |
| 1044.0 | 0.007 |
| 1043.0 | 0.005 |
| 1042.0 | 0.008 |
| 1041.0 | 0.007 |
| 1040.0 | 0.008 |
| 1039.0 | 0.005 |
| 1038.0 | 0.008 |
| 1037.0 | 0.006 |
| 1036.0 | 0.007 |
| 1035.0 | 0.005 |
| 1034.0 | 0.005 |
| 1033.0 | 0.005 |
| 1032.0 | 0.003 |
| 1031.0 | 0.006 |
| 1030.0 | 0.005 |
| 1029.0 | 0.005 |
| 1028.0 | 0.004 |
| 1027.0 | 0.005 |
| 1026.0 | 0.004 |
| 1025.0 | 0.005 |
| 1024.0 | 0.006 |
| 1023.0 | 0.004 |
| 1022.0 | 0.006 |
| 1021.0 | 0.003 |
| 1020.0 | 0.004 |
| 1019.0 | 0.004 |
| 1018.0 | 0.004 |
| 1017.0 | 0.006 |
| 1016.0 | 0.003 |
| 1015.0 | 0.005 |
| 1014.0 | 0.006 |
| 1013.0 | 0.006 |
| 1012.0 | 0.005 |
| 1011.0 | 0.003 |
| 1010.0 | 0.007 |
| 1009.0 | 0.008 |
| 1008.0 | 0.007 |
| 1007.0 | 0.005 |
| 1006.0 | 0.003 |
| 1005.0 | 0.006 |
| 1004.0 | 0.006 |
| 1003.0 | 0.004 |
| 1002.0 | 0.005 |
| 1001.0 | 0.006 |
| 1000.0 | 0.006 |
| 999.0 | 0.004 |
| 998.0 | 0.006 |
| 997.0 | 0.006 |
| 996.0 | 0.006 |
| 995.0 | 0.007 |
| 994.0 | 0.005 |
| 993.0 | 0.004 |
| 992.0 | 0.004 |
| 991.0 | 0.006 |
| 990.0 | 0.005 |
| 989.0 | 0.005 |
| 988.0 | 0.006 |
| 987.0 | 0.003 |
| 986.0 | 0.005 |
| 985.0 | 0.006 |
| 984.0 | 0.004 |
| 983.0 | 0.004 |
| 982.0 | 0.005 |
| 981.0 | 0.006 |
| 980.0 | 0.004 |
| 979.0 | 0.005 |
| 978.0 | 0.005 |
| 977.0 | 0.006 |
| 976.0 | 0.007 |
| 975.0 | 0.005 |
| 974.0 | 0.005 |
| 973.0 | 0.003 |
| 972.0 | 0.004 |
| 971.0 | 0.003 |
| 970.0 | 0.005 |
| 969.0 | 0.003 |
| 968.0 | 0.004 |
| 967.0 | 0.005 |
| 966.0 | 0.006 |
| 965.0 | 0.006 |
| 964.0 | 0.006 |
| 963.0 | 0.005 |
| 962.0 | 0.003 |
| 961.0 | 0.006 |
| 960.0 | 0.003 |
| 959.0 | 0.004 |
| 958.0 | 0.005 |
| 957.0 | 0.008 |
| 956.0 | 0.003 |
| 955.0 | 0.006 |
| 954.0 | 0.004 |
| 953.0 | 0.007 |
| 952.0 | 0.005 |
| 951.0 | 0.004 |
| 950.0 | 0.003 |
| 949.0 | 0.006 |
| 948.0 | 0.005 |
| 947.0 | 0.005 |
| 946.0 | 0.006 |
| 945.0 | 0.005 |
| 944.0 | 0.005 |
| 943.0 | 0.005 |
| 942.0 | 0.007 |
| 941.0 | 0.006 |
| 940.0 | 0.005 |
| 939.0 | 0.004 |
| 938.0 | 0.006 |
| 937.0 | 0.004 |
| 936.0 | 0.004 |
| 935.0 | 0.006 |
| 934.0 | 0.005 |
| 933.0 | 0.003 |
| 932.0 | 0.006 |
| 931.0 | 0.005 |
| 930.0 | 0.005 |
| 929.0 | 0.005 |
| 928.0 | 0.004 |
| 927.0 | 0.004 |
| 926.0 | 0.006 |
| 925.0 | 0.004 |
| 924.0 | 0.002 |
| 923.0 | 0.005 |
| 922.0 | 0.005 |
| 921.0 | 0.004 |
| 920.0 | 0.006 |
| 919.0 | 0.004 |
| 918.0 | 0.002 |
| 917.0 | 0.007 |
| 916.0 | 0.007 |
| 915.0 | 0.007 |
| 914.0 | 0.002 |
| 913.0 | 0.005 |
| 912.0 | 0.005 |
| 911.0 | 0.006 |
| 910.0 | 0.006 |
| 909.0 | 0.007 |
| 908.0 | 0.004 |
| 907.0 | 0.003 |
| 906.0 | 0.007 |
| 905.0 | 0.004 |
| 904.0 | 0.007 |
| 903.0 | 0.006 |
| 902.0 | 0.005 |
| 901.0 | 0.004 |
| 900.0 | 0.005 |
| 899.0 | 0.006 |
| 898.0 | 0.005 |
| 897.0 | 0.002 |
| 896.0 | 0.006 |
| 895.0 | 0.008 |
| 894.0 | 0.005 |
| 893.0 | 0.005 |
| 892.0 | 0.003 |
| 891.0 | 0.005 |
| 890.0 | 0.007 |
| 889.0 | 0.007 |
| 888.0 | 0.006 |
| 887.0 | 0.007 |
| 886.0 | 0.005 |
| 885.0 | 0.005 |
| 884.0 | 0.005 |
| 883.0 | 0.006 |
| 882.0 | 0.005 |
| 881.0 | 0.004 |
| 880.0 | 0.003 |
| 879.0 | 0.006 |
| 878.0 | 0.006 |
| 877.0 | 0.005 |
| 876.0 | 0.006 |
| 875.0 | 0.007 |
| 874.0 | 0.003 |
| 873.0 | 0.005 |
| 872.0 | 0.009 |
| 871.0 | 0.006 |
| 870.0 | 0.008 |
| 869.0 | 0.005 |
| 868.0 | 0.005 |
| 867.0 | 0.005 |
| 866.0 | 0.007 |
| 865.0 | 0.004 |
| 864.0 | 0.004 |
| 863.0 | 0.006 |
| 862.0 | 0.006 |
| 861.0 | 0.007 |
| 860.0 | 0.008 |
| 859.0 | 0.007 |
| 858.0 | 0.005 |
| 857.0 | 0.006 |
| 856.0 | 0.004 |
| 855.0 | 0.006 |
| 854.0 | 0.004 |
| 853.0 | 0.004 |
| 852.0 | 0.005 |
| 851.0 | 0.003 |
| 850.0 | 0.004 |
| 849.0 | 0.002 |
| 848.0 | 0.005 |
| 847.0 | 0.005 |
| 846.0 | 0.004 |
| 845.0 | 0.005 |
| 844.0 | 0.003 |
| 843.0 | 0.007 |
| 842.0 | 0.003 |
| 841.0 | 0.004 |
| 840.0 | 0.005 |
| 839.0 | 0.005 |
| 838.0 | 0.007 |
| 837.0 | 0.004 |
| 836.0 | 0.007 |
| 835.0 | 0.007 |
| 834.0 | 0.004 |
| 833.0 | 0.004 |
| 832.0 | 0.005 |
| 831.0 | 0.006 |
| 830.0 | 0.003 |
| 829.0 | 0.005 |
| 828.0 | 0.004 |
| 827.0 | 0.005 |
| 826.0 | 0.006 |
| 825.0 | 0.006 |
| 824.0 | 0.005 |
| 823.0 | 0.006 |
| 822.0 | 0.004 |
| 821.0 | 0.005 |
| 820.0 | 0.007 |
| 819.0 | 0.006 |
| 818.0 | 0.005 |
| 817.0 | 0.004 |
| 816.0 | 0.005 |
| 815.0 | 0.004 |
| 814.0 | 0.007 |
| 813.0 | 0.005 |
| 812.0 | 0.004 |
| 811.0 | 0.005 |
| 810.0 | 0.005 |
| 809.0 | 0.004 |
| 808.0 | 0.007 |
| 807.0 | 0.005 |
| 806.0 | 0.005 |
| 805.0 | 0.006 |
| 804.0 | 0.003 |
| 803.0 | 0.007 |
| 802.0 | 0.003 |
| 801.0 | 0.004 |
| 800.0 | 0.004 |
| 799.0 | 0 |
| 798.0 | 0 |
| 797.0 | 0 |
| 796.0 | 0 |
| 795.0 | 0 |
| 794.0 | 0 |
| 793.0 | 0 |
| 792.0 | 0 |
| 791.0 | 0 |
| 790.0 | 0 |
| 789.0 | 0.001 |
| 788.0 | 0 |
| 787.0 | 0 |
| 786.0 | 0 |
| 785.0 | 0 |
| 784.0 | 0 |
| 783.0 | 0 |
| 782.0 | 0 |
| 781.0 | 0 |
| 780.0 | 0 |
| 779.0 | 0 |
| 778.0 | 0 |
| 777.0 | 0 |
| 776.0 | 0 |
| 775.0 | 0 |
| 774.0 | 0 |
| 773.0 | 0 |
| 772.0 | 0 |
| 771.0 | 0 |
| 770.0 | 0 |
| 769.0 | 0 |
| 768.0 | 0 |
| 767.0 | 0 |
| 766.0 | 0 |
| 765.0 | 0 |
| 764.0 | 0 |
| 763.0 | 0 |
| 762.0 | 0 |
| 761.0 | 0 |
| 760.0 | 0 |
| 759.0 | 0 |
| 758.0 | 0 |
| 757.0 | 0 |
| 756.0 | 0 |
| 755.0 | 0 |
| 754.0 | 0 |
| 753.0 | 0 |
| 752.0 | 0 |
| 751.0 | 0 |
| 750.0 | 0 |
| 749.0 | 0 |
| 748.0 | 0 |
| 747.0 | 0 |
| 746.0 | 0 |
| 745.0 | 0 |
| 744.0 | 0 |
| 743.0 | 0 |
| 742.0 | 0 |
| 741.0 | 0 |
| 740.0 | 0 |
| 739.0 | 0 |
| 738.0 | 0 |
| 737.0 | 0 |
| 736.0 | 0 |
| 735.0 | 0 |
| 734.0 | 0 |
| 733.0 | 0 |
| 732.0 | 0 |
| 731.0 | 0 |
| 730.0 | 0 |
| 729.0 | 0 |
| 728.0 | 0 |
| 727.0 | 0 |
| 726.0 | 0 |
| 725.0 | 0 |
| 724.0 | 0 |
| 723.0 | 0 |
| 722.0 | 0 |
| 721.0 | 0 |
| 720.0 | 0 |
| 719.0 | 0 |
| 718.0 | 0 |
| 717.0 | 0 |
| 716.0 | 0 |
| 715.0 | 0 |
| 714.0 | 0 |
| 713.0 | 0 |
| 712.0 | 0 |
| 711.0 | 0 |
| 710.0 | 0 |
| 709.0 | 0 |
| 708.0 | 0 |
| 707.0 | 0 |
| 706.0 | 0 |
| 705.0 | 0 |
| 704.0 | 0 |
| 703.0 | 0 |
| 702.0 | 0 |
| 701.0 | 0 |
| 700.0 | 0 |
| 699.0 | 0 |
| 698.0 | 0 |
| 697.0 | 0 |
| 696.0 | 0 |
| 695.0 | 0 |
| 694.0 | 0 |
| 693.0 | 0 |
| 692.0 | 0 |
| 691.0 | 0 |
| 690.0 | 0 |
| 689.0 | 0 |
| 688.0 | 0 |
| 687.0 | 0 |
| 686.0 | 0 |
| 685.0 | 0 |
| 684.0 | 0 |
| 683.0 | 0 |
| 682.0 | 0 |
| 681.0 | 0 |
| 680.0 | 0 |
| 679.0 | 0 |
| 678.0 | 0 |
| 677.0 | 0 |
| 676.0 | 0 |
| 675.0 | 0 |
| 674.0 | 0 |
| 673.0 | 0 |
| 672.0 | 0 |
| 671.0 | 0 |
| 670.0 | 0 |
| 669.0 | 0 |
| 668.0 | 0 |
| 667.0 | 0 |
| 666.0 | 0 |
| 665.0 | 0 |
| 664.0 | 0 |
| 663.0 | 0 |
| 662.0 | 0 |
| 661.0 | 0 |
| 660.0 | 0 |
| 659.0 | 0 |
| 658.0 | 0 |
| 657.0 | 0 |
| 656.0 | 0 |
| 655.0 | 0 |
| 654.0 | 0 |
| 653.0 | 0 |
| 652.0 | 0 |
| 651.0 | 0 |
| 650.0 | 0 |
| 649.0 | 0 |
| 648.0 | 0 |
| 647.0 | 0 |
| 646.0 | 0 |
| 645.0 | 0 |
| 644.0 | 0 |
| 643.0 | 0 |
| 642.0 | 0 |
| 641.0 | 0 |
| 640.0 | 0 |
| 639.0 | 0 |
| 638.0 | 0 |
| 637.0 | 0 |
| 636.0 | 0 |
| 635.0 | 0 |
| 634.0 | 0 |
| 633.0 | 0 |
| 632.0 | 0 |
| 631.0 | 0 |
| 630.0 | 0 |
| 629.0 | 0 |
| 628.0 | 0 |
| 627.0 | 0 |
| 626.0 | 0 |
| 625.0 | 0 |
| 624.0 | 0 |
| 623.0 | 0 |
| 622.0 | 0 |
| 621.0 | 0 |
| 620.0 | 0 |
| 619.0 | 0 |
| 618.0 | 0 |
| 617.0 | 0 |
| 616.0 | 0 |
| 615.0 | 0 |
| 614.0 | 0 |
| 613.0 | 0 |
| 612.0 | 0 |
| 611.0 | 0 |
| 610.0 | 0 |
| 609.0 | 0 |
| 608.0 | 0 |
| 607.0 | 0 |
| 606.0 | 0 |
| 605.0 | 0 |
| 604.0 | 0 |
| 603.0 | 0 |
| 602.0 | 0 |
| 601.0 | 0 |
| 600.0 | 0 |
| 599.0 | 0 |
| 598.0 | 0 |
| 597.0 | 0 |
| 596.0 | 0 |
| 595.0 | 0 |
| 594.0 | 0 |
| 593.0 | 0 |
| 592.0 | 0 |
| 591.0 | 0 |
| 590.0 | 0 |
| 589.0 | 0 |
| 588.0 | 0 |
| 587.0 | 0 |
| 586.0 | 0 |
| 585.0 | 0 |
| 584.0 | 0 |
| 583.0 | 0 |
| 582.0 | 0 |
| 581.0 | 0 |
| 580.0 | 0 |
| 579.0 | 0 |
| 578.0 | 0 |
| 577.0 | 0 |
| 576.0 | 0 |
| 575.0 | 0 |
| 574.0 | 0 |
| 573.0 | 0 |
| 572.0 | 0 |
| 571.0 | 0 |
| 570.0 | 0 |
| 569.0 | 0 |
| 568.0 | 0 |
| 567.0 | 0 |
| 566.0 | 0 |
| 565.0 | 0 |
| 564.0 | 0 |
| 563.0 | 0 |
| 562.0 | 0 |
| 561.0 | 0 |
| 560.0 | 0 |
| 559.0 | 0 |
| 558.0 | 0 |
| 557.0 | 0 |
| 556.0 | 0 |
| 555.0 | 0 |
| 554.0 | 0 |
| 553.0 | 0 |
| 552.0 | 0 |
| 551.0 | 0 |
| 550.0 | 0 |
| 549.0 | 0 |
| 548.0 | 0 |
| 547.0 | 0 |
| 546.0 | 0 |
| 545.0 | 0 |
| 544.0 | 0 |
| 543.0 | 0 |
| 542.0 | 0 |
| 541.0 | 0 |
| 540.0 | 0 |
| 539.0 | 0 |
| 538.0 | 0 |
| 537.0 | 0 |
| 536.0 | 0 |
| 535.0 | 0 |
| 534.0 | 0 |
| 533.0 | 0 |
| 532.0 | 0 |
| 531.0 | 0 |
| 530.0 | 0 |
| 529.0 | 0 |
| 528.0 | 0 |
| 527.0 | 0 |
| 526.0 | 0 |
| 525.0 | 0 |
| 524.0 | 0 |
| 523.0 | 0 |
| 522.0 | 0 |
| 521.0 | 0 |
| 520.0 | 0 |
| 519.0 | 0 |
| 518.0 | 0 |
| 517.0 | 0 |
| 516.0 | 0 |
| 515.0 | 0 |
| 514.0 | 0 |
| 513.0 | 0 |
| 512.0 | 0 |
| 511.0 | 0 |
| 510.0 | 0 |
| 509.0 | 0 |
| 508.0 | 0 |
| 507.0 | 0 |
| 506.0 | 0 |
| 505.0 | 0 |
| 504.0 | 0 |
| 503.0 | 0 |
| 502.0 | 0 |
| 501.0 | 0 |
| 500.0 | 0 |
| 499.0 | 0 |
| 498.0 | 0 |
| 497.0 | 0 |
| 496.0 | 0 |
| 495.0 | 0 |
| 494.0 | 0 |
| 493.0 | 0 |
| 492.0 | 0 |
| 491.0 | 0 |
| 490.0 | 0 |
| 489.0 | 0 |
| 488.0 | 0 |
| 487.0 | 0 |
| 486.0 | 0 |
| 485.0 | 0 |
| 484.0 | 0 |
| 483.0 | 0 |
| 482.0 | 0 |
| 481.0 | 0 |
| 480.0 | 0 |
| 479.0 | 0 |
| 478.0 | 0 |
| 477.0 | 0 |
| 476.0 | 0 |
| 475.0 | 0 |
| 474.0 | 0 |
| 473.0 | 0 |
| 472.0 | 0 |
| 471.0 | 0 |
| 470.0 | 0 |
| 469.0 | 0 |
| 468.0 | 0 |
| 467.0 | 0 |
| 466.0 | 0 |
| 465.0 | 0 |
| 464.0 | 0 |
| 463.0 | 0 |
| 462.0 | 0 |
| 461.0 | 0 |
| 460.0 | 0 |
| 459.0 | 0 |
| 458.0 | 0 |
| 457.0 | 0 |
| 456.0 | 0 |
| 455.0 | 0 |
| 454.0 | 0 |
| 453.0 | 0 |
| 452.0 | 0 |
| 451.0 | 0 |
| 450.0 | 0 |
| 449.0 | 0 |
| 448.0 | 0 |
| 447.0 | 0 |
| 446.0 | 0 |
| 445.0 | 0 |
| 444.0 | 0 |
| 443.0 | 0 |
| 442.0 | 0 |
| 441.0 | 0 |
| 440.0 | 0 |
| 439.0 | 0 |
| 438.0 | 0 |
| 437.0 | 0 |
| 436.0 | 0 |
| 435.0 | 0 |
| 434.0 | 0 |
| 433.0 | 0 |
| 432.0 | 0 |
| 431.0 | 0 |
| 430.0 | 0 |
| 429.0 | 0 |
| 428.0 | 0 |
| 427.0 | 0 |
| 426.0 | 0 |
| 425.0 | 0 |
| 424.0 | 0 |
| 423.0 | 0 |
| 422.0 | 0 |
| 421.0 | 0 |
| 420.0 | 0 |
| 419.0 | 0 |
| 418.0 | 0 |
| 417.0 | 0 |
| 416.0 | 0 |
| 415.0 | 0 |
| 414.0 | 0 |
| 413.0 | 0.001 |
| 412.0 | 0.001 |
| 411.0 | 0.001 |
| 410.0 | 0.001 |
| 409.0 | 0.001 |
| 408.0 | 0.002 |
| 407.0 | 0.002 |
| 406.0 | 0.003 |
| 405.0 | 0.003 |
| 404.0 | 0.004 |
| 403.0 | 0.005 |
| 402.0 | 0.007 |
| 401.0 | 0.009 |
| 400.0 | 0.012 |
| 399.0 | 0.016 |
| 398.0 | 0.023 |
| 397.0 | 0.032 |
| 396.0 | 0.046 |
| 395.0 | 0.068 |
| 394.0 | 0.105 |
| 393.0 | 0.167 |
| 392.0 | 0.277 |
| 391.0 | 0.487 |
| 390.0 | 0.91 |
| 389.0 | 1.815 |
| 388.0 | 3.823 |
| 387.0 | 7.973 |
| 386.0 | 14.936 |
| 385.0 | 23.019 |
| 384.0 | 28.936 |
| 383.0 | 31.419 |
| 382.0 | 31.626 |
| 381.0 | 30.896 |
| 380.0 | 29.49 |
| 379.0 | 26.926 |
| 378.0 | 22.188 |
| 377.0 | 15.359 |
| 376.0 | 8.616 |
| 375.0 | 4.012 |
| 374.0 | 1.706 |
| 373.0 | 0.739 |
| 372.0 | 0.339 |
| 371.0 | 0.168 |
| 370.0 | 0.088 |
| 369.0 | 0.048 |
| 368.0 | 0.027 |
| 367.0 | 0.016 |
| 366.0 | 0.01 |
| 365.0 | 0.006 |
| 364.0 | 0.003 |
| 363.0 | 0.002 |
| 362.0 | 0.001 |
| 361.0 | 0.001 |
| 360.0 | 0 |
| 359.0 | 0 |
| 358.0 | 0 |
| 357.0 | 0 |
| 356.0 | 0 |
| 355.0 | 0 |
| 354.0 | 0 |
| 353.0 | 0 |
| 352.0 | 0 |
| 351.0 | 0 |
| 350.0 | 0 |
| 349.0 | 0.002 |
| 348.0 | 0 |
| 347.0 | 0 |
| 346.0 | 0 |
| 345.0 | 0 |
| 344.0 | 0 |
| 343.0 | 0 |
| 342.0 | 0 |
| 341.0 | 0 |
| 340.0 | 0 |
| 339.0 | 0 |
| 338.0 | 0 |
| 337.0 | 0 |
| 336.0 | 0 |
| 335.0 | 0 |
| 334.0 | 0 |
| 333.0 | 0 |
| 332.0 | 0 |
| 331.0 | 0 |
| 330.0 | 0 |
| 329.0 | 0 |
| 328.0 | 0 |
| 327.0 | 0 |
| 326.0 | 0 |
| 325.0 | 0 |
| 324.0 | 0 |
| 323.0 | 0 |
| 322.0 | 0 |
| 321.0 | 0 |
| 320.0 | 0 |
| 319.0 | 0 |
| 318.0 | 0 |
| 317.0 | 0 |
| 316.0 | 0 |
| 315.0 | 0 |
| 314.0 | 0 |
| 313.0 | 0 |
| 312.0 | 0 |
| 311.0 | 0 |
| 310.0 | 0 |
| 309.0 | 0 |
| 308.0 | 0 |
| 307.0 | 0 |
| 306.0 | 0 |
| 305.0 | 0 |
| 304.0 | 0 |
| 303.0 | 0 |
| 302.0 | 0 |
| 301.0 | 0 |
| 300.0 | 0 |
| 299.0 | 0 |
| 298.0 | 0 |
| 297.0 | 0 |
| 296.0 | 0 |
| 295.0 | 0 |
| 294.0 | 0 |
| 293.0 | 0 |
| 292.0 | 0 |
| 291.0 | 0 |
| 290.0 | 0 |
| 289.0 | 0 |
| 288.0 | 0 |
| 287.0 | 0 |
| 286.0 | 0 |
| 285.0 | 0 |
| 284.0 | 0 |
| 283.0 | 0 |
| 282.0 | 0 |
| 281.0 | 0 |
| 280.0 | 0 |
| 279.0 | 0 |
| 278.0 | 0 |
| 277.0 | 0 |
| 276.0 | 0 |
| 275.0 | 0 |
| 274.0 | 0 |
| 273.0 | 0 |
| 272.0 | 0 |
| 271.0 | 0 |
| 270.0 | 0 |
| 269.0 | 0 |
| 268.0 | 0 |
| 267.0 | 0 |
| 266.0 | 0 |
| 265.0 | 0 |
| 264.0 | 0 |
| 263.0 | 0 |
| 262.0 | 0 |
| 261.0 | 0 |
| 260.0 | 0 |
| 259.0 | 0 |
| 258.0 | 0 |
| 257.0 | 0 |
| 256.0 | 0 |
| 255.0 | 0 |
| 254.0 | 0 |
| 253.0 | 0 |
| 252.0 | 0 |
| 251.0 | 0 |
| 250.0 | 0 |
| 249.0 | 0 |
| 248.0 | 0 |
| 247.0 | 0 |
| 246.0 | 0 |
| 245.0 | 0 |
| 244.0 | 0 |
| 243.0 | 0 |
| 242.0 | 0 |
| 241.0 | 0 |
| 240.0 | 0 |
| 239.0 | 0 |
| 238.0 | 0 |
| 237.0 | 0 |
| 236.0 | 0 |
| 235.0 | 0 |
| 234.0 | 0 |
| 233.0 | 0 |
| 232.0 | 0 |
| 231.0 | 0 |
| 230.0 | 0 |
| 229.0 | 0 |
| 228.0 | 0 |
| 227.0 | 0 |
| 226.0 | 0 |
| 225.0 | 0 |
| 224.0 | 0 |
| 223.0 | 0 |
| 222.0 | 0 |
| 221.0 | 0 |
| 220.0 | 0 |
| 219.0 | 0 |
| 218.0 | 0 |
| 217.0 | 0 |
| 216.0 | 0 |
| 215.0 | 0 |
| 214.0 | 0 |
| 213.0 | 0 |
| 212.0 | 0 |
| 211.0 | 0 |
| 210.0 | 0 |
| 209.0 | 0 |
| 208.0 | 0 |
| 207.0 | 0 |
| 206.0 | 0 |
| 205.0 | 0 |
| 204.0 | 0 |
| 203.0 | 0 |
| 202.0 | 0 |
| 201.0 | 0 |